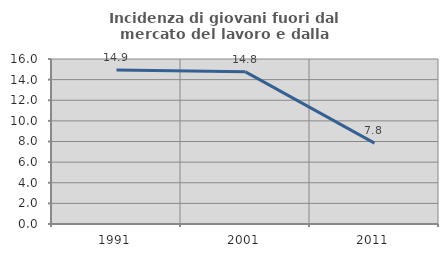
| Category | Incidenza di giovani fuori dal mercato del lavoro e dalla formazione  |
|---|---|
| 1991.0 | 14.943 |
| 2001.0 | 14.754 |
| 2011.0 | 7.843 |